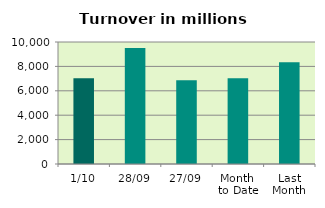
| Category | Series 0 |
|---|---|
| 1/10 | 7034.572 |
| 28/09 | 9508.999 |
| 27/09 | 6874.013 |
| Month 
to Date | 7034.572 |
| Last
Month | 8346.546 |